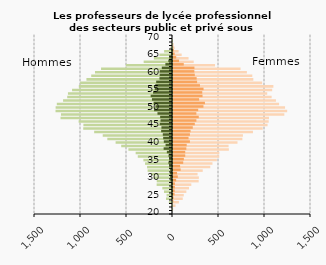
| Category | Femmes public | Femmes privé |
|---|---|---|
| 20.0 | 0 | 0 |
| 21.0 | 2 | 0 |
| 22.0 | 27 | 0 |
| 23.0 | 64 | 4 |
| 24.0 | 106 | 6 |
| 25.0 | 117 | 17 |
| 26.0 | 145 | 18 |
| 27.0 | 174 | 20 |
| 28.0 | 199 | 21 |
| 29.0 | 279 | 34 |
| 30.0 | 281 | 52 |
| 31.0 | 267 | 44 |
| 32.0 | 323 | 83 |
| 33.0 | 405 | 77 |
| 34.0 | 429 | 111 |
| 35.0 | 477 | 118 |
| 36.0 | 503 | 133 |
| 37.0 | 504 | 133 |
| 38.0 | 607 | 145 |
| 39.0 | 604 | 149 |
| 40.0 | 701 | 184 |
| 41.0 | 754 | 169 |
| 42.0 | 760 | 184 |
| 43.0 | 869 | 191 |
| 44.0 | 975 | 215 |
| 45.0 | 1028 | 237 |
| 46.0 | 1040 | 254 |
| 47.0 | 1043 | 280 |
| 48.0 | 1210 | 254 |
| 49.0 | 1241 | 274 |
| 50.0 | 1218 | 331 |
| 51.0 | 1153 | 347 |
| 52.0 | 1119 | 284 |
| 53.0 | 1072 | 321 |
| 54.0 | 1024 | 318 |
| 55.0 | 1078 | 332 |
| 56.0 | 1091 | 293 |
| 57.0 | 969 | 262 |
| 58.0 | 873 | 257 |
| 59.0 | 862 | 237 |
| 60.0 | 803 | 232 |
| 61.0 | 734 | 233 |
| 62.0 | 457 | 117 |
| 63.0 | 225 | 65 |
| 64.0 | 169 | 35 |
| 65.0 | 94 | 18 |
| 66.0 | 61 | 9 |
| 67.0 | 17 | 3 |
| 68.0 | 7 | 0 |
| 69.0 | 0 | 0 |
| 70.0 | 0 | 0 |